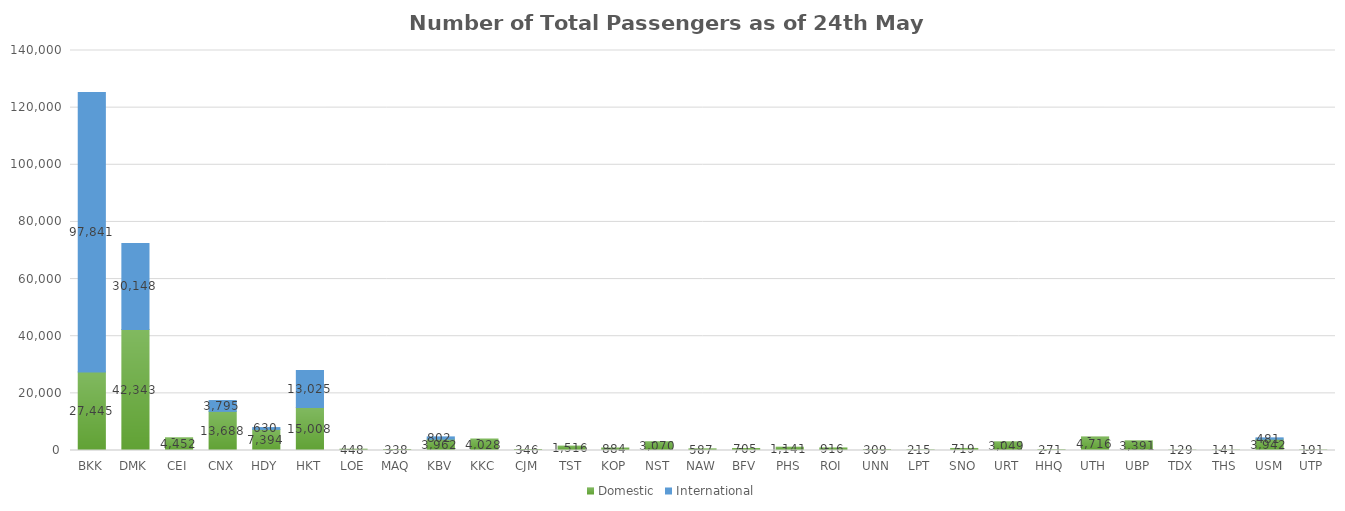
| Category | Domestic | International |
|---|---|---|
| BKK | 27445 | 97841 |
| DMK | 42343 | 30148 |
| CEI | 4452 | 0 |
| CNX | 13688 | 3795 |
| HDY | 7394 | 630 |
| HKT | 15008 | 13025 |
| LOE | 448 | 0 |
| MAQ | 338 | 0 |
| KBV | 3962 | 802 |
| KKC | 4028 | 0 |
| CJM | 346 | 0 |
| TST | 1516 | 0 |
| KOP | 884 | 0 |
| NST | 3070 | 0 |
| NAW | 587 | 0 |
| BFV | 705 | 0 |
| PHS | 1141 | 0 |
| ROI | 916 | 0 |
| UNN | 309 | 0 |
| LPT | 215 | 0 |
| SNO | 719 | 0 |
| URT | 3049 | 0 |
| HHQ | 271 | 0 |
| UTH | 4716 | 0 |
| UBP | 3391 | 0 |
| TDX | 129 | 0 |
| THS | 141 | 0 |
| USM | 3942 | 481 |
| UTP | 191 | 0 |